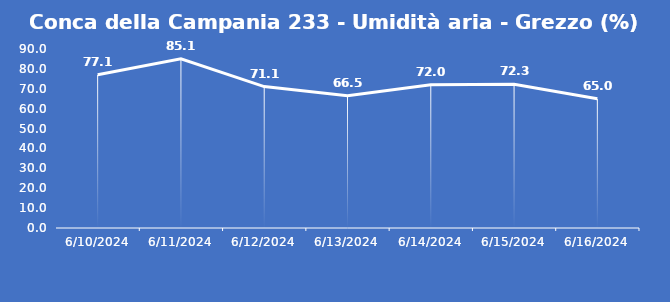
| Category | Conca della Campania 233 - Umidità aria - Grezzo (%) |
|---|---|
| 6/10/24 | 77.1 |
| 6/11/24 | 85.1 |
| 6/12/24 | 71.1 |
| 6/13/24 | 66.5 |
| 6/14/24 | 72 |
| 6/15/24 | 72.3 |
| 6/16/24 | 65 |